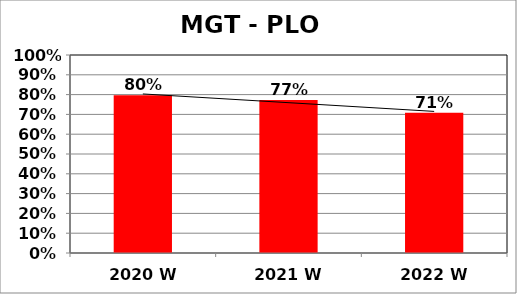
| Category | Series 0 |
|---|---|
| 2020 W | 0.797 |
| 2021 W | 0.772 |
| 2022 W | 0.709 |